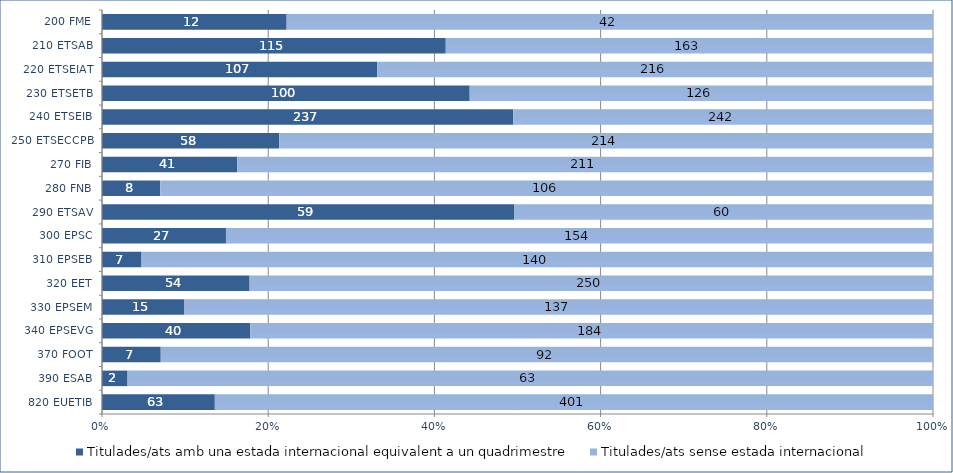
| Category | Titulades/ats amb una estada internacional equivalent a un quadrimestre | Titulades/ats sense estada internacional |
|---|---|---|
| 820 EUETIB | 63 | 401 |
| 390 ESAB | 2 | 63 |
| 370 FOOT | 7 | 92 |
| 340 EPSEVG | 40 | 184 |
| 330 EPSEM | 15 | 137 |
| 320 EET | 54 | 250 |
| 310 EPSEB | 7 | 140 |
| 300 EPSC | 27 | 154 |
| 290 ETSAV | 59 | 60 |
| 280 FNB | 8 | 106 |
| 270 FIB | 41 | 211 |
| 250 ETSECCPB | 58 | 214 |
| 240 ETSEIB | 237 | 242 |
| 230 ETSETB | 100 | 126 |
| 220 ETSEIAT | 107 | 216 |
| 210 ETSAB | 115 | 163 |
| 200 FME | 12 | 42 |